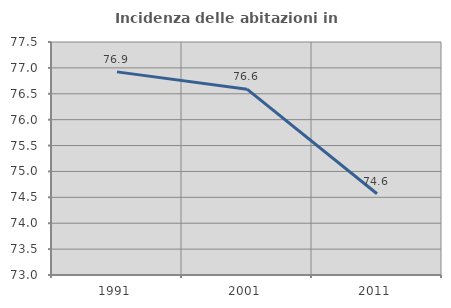
| Category | Incidenza delle abitazioni in proprietà  |
|---|---|
| 1991.0 | 76.923 |
| 2001.0 | 76.59 |
| 2011.0 | 74.568 |